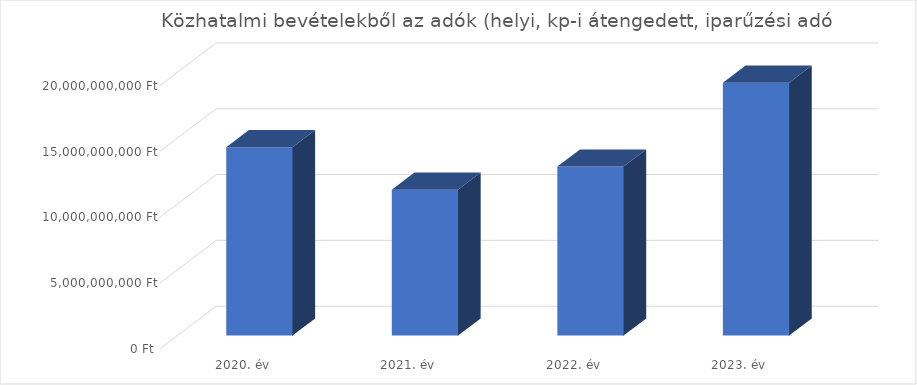
| Category | adók (helyi, kp-i átengedett)(iparűzési adó) |
|---|---|
| 2020. év | 14312470000 |
| 2021. év | 11084019000 |
| 2022. év | 12840884000 |
| 2023. év | 19214488000 |